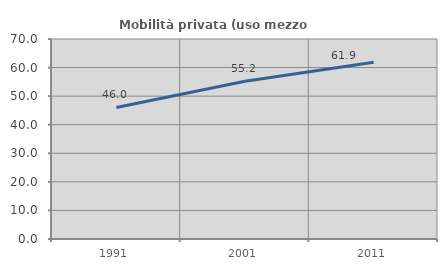
| Category | Mobilità privata (uso mezzo privato) |
|---|---|
| 1991.0 | 46.045 |
| 2001.0 | 55.235 |
| 2011.0 | 61.885 |